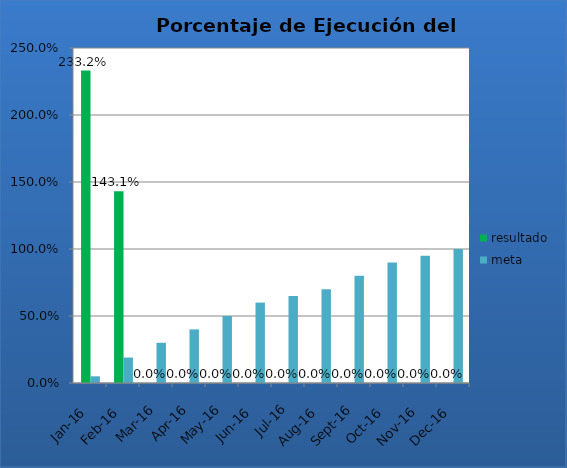
| Category | resultado | meta |
|---|---|---|
| ene-16 | 2.332 | 0.05 |
| feb-16 | 1.431 | 0.19 |
| mar-16 | 0 | 0.3 |
| abr-16 | 0 | 0.4 |
| may-16 | 0 | 0.5 |
| jun-16 | 0 | 0.6 |
| jul-16 | 0 | 0.65 |
| ago-16 | 0 | 0.7 |
| sep-16 | 0 | 0.8 |
| oct-16 | 0 | 0.9 |
| nov-16 | 0 | 0.95 |
| dic-16 | 0 | 1 |